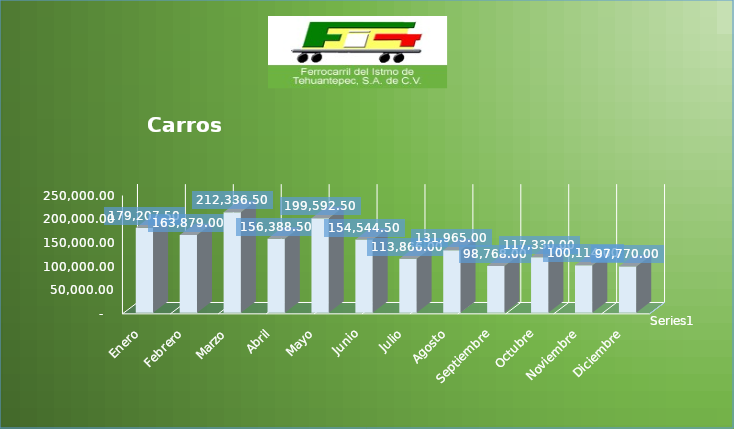
| Category | Series 0 |
|---|---|
| Enero | 179207.5 |
| Febrero | 163879 |
| Marzo | 212336.5 |
| Abril | 156388.5 |
| Mayo | 199592.5 |
| Junio | 154544.5 |
| Julio | 113866 |
| Agosto | 131965 |
| Septiembre | 98768 |
| Octubre | 117330 |
| Noviembre | 100114 |
| Diciembre | 97770 |